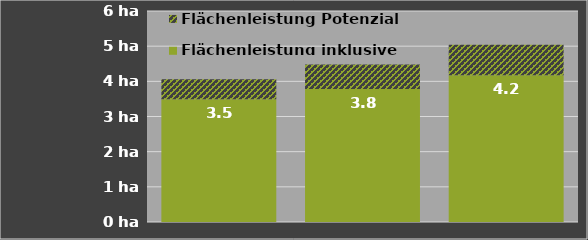
| Category | Flächenleistung inklusive Anfahrt | Flächenleistung Potenzial |
|---|---|---|
| 0 | 3.488 | 0.569 |
| 1 | 3.784 | 0.698 |
| 2 | 4.175 | 0.867 |